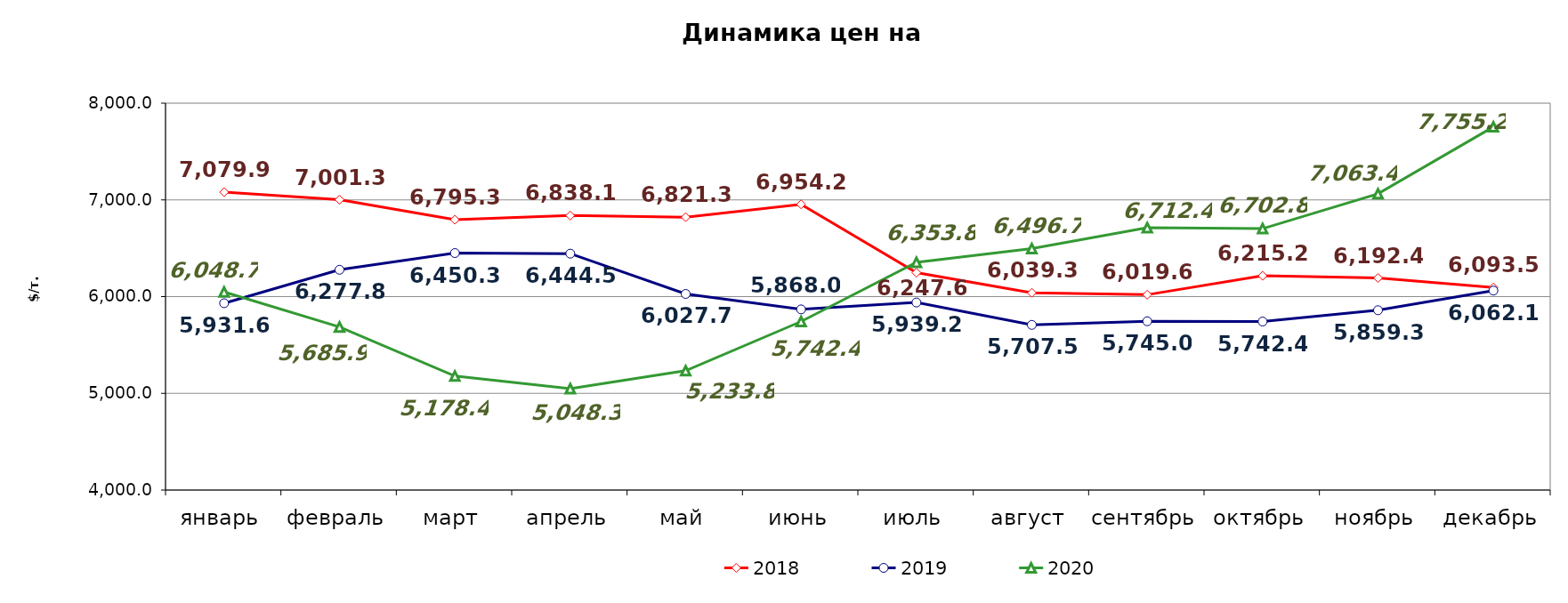
| Category | 2018 | 2019 | 2020 |
|---|---|---|---|
| январь | 7079.88 | 5931.58 | 6048.65 |
| февраль | 7001.33 | 6277.77 | 5685.88 |
| март | 6795.25 | 6450.312 | 5178.4 |
| апрель | 6838.07 | 6444.5 | 5048.25 |
| май | 6821.3 | 6027.705 | 5233.818 |
| июнь | 6954.17 | 5867.965 | 5742.388 |
| июль | 6247.62 | 5939.2 | 6353.76 |
| август | 6039.26 | 5707.548 | 6496.7 |
| сентябрь | 6019.61 | 5744.988 | 6712.41 |
| октябрь | 6215.231 | 5742.39 | 6702.771 |
| ноябрь | 6192.385 | 5859.31 | 7063.429 |
| декабрь | 6093.515 | 6062.06 | 7755.239 |